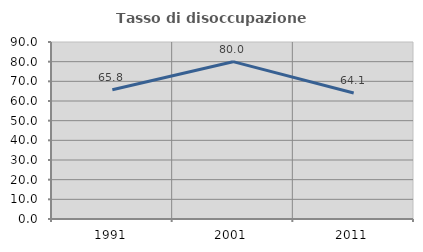
| Category | Tasso di disoccupazione giovanile  |
|---|---|
| 1991.0 | 65.753 |
| 2001.0 | 80 |
| 2011.0 | 64.103 |